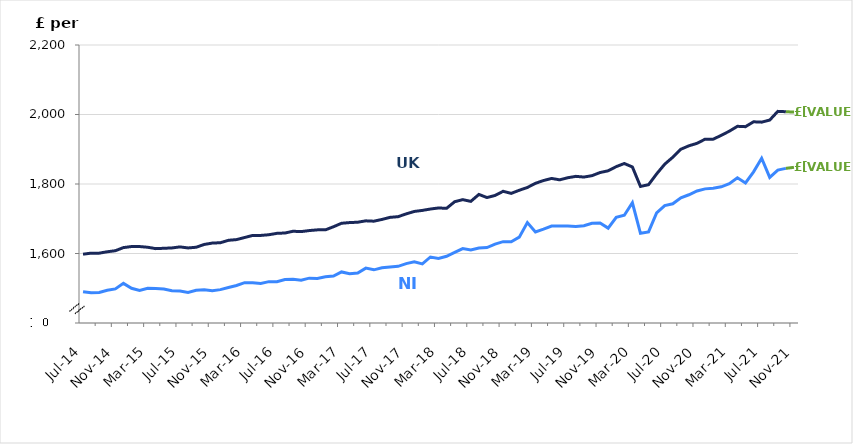
| Category | Series 0 | Series 1 |
|---|---|---|
| 2014-07-01 | 1490 | 1598 |
| 2014-08-01 | 1487 | 1601 |
| 2014-09-01 | 1488 | 1601 |
| 2014-10-01 | 1494 | 1605 |
| 2014-11-01 | 1498 | 1608 |
| 2014-12-01 | 1514 | 1617 |
| 2015-01-01 | 1500 | 1620 |
| 2015-02-01 | 1494 | 1620 |
| 2015-03-01 | 1500 | 1618 |
| 2015-04-01 | 1499 | 1614 |
| 2015-05-01 | 1498 | 1615 |
| 2015-06-01 | 1493 | 1616 |
| 2015-07-01 | 1492 | 1619 |
| 2015-08-01 | 1488 | 1616 |
| 2015-09-01 | 1494 | 1618 |
| 2015-10-01 | 1496 | 1626 |
| 2015-11-01 | 1493 | 1630 |
| 2015-12-01 | 1496 | 1631 |
| 2016-01-01 | 1502 | 1638 |
| 2016-02-01 | 1508 | 1640 |
| 2016-03-01 | 1516 | 1646 |
| 2016-04-01 | 1516 | 1652 |
| 2016-05-01 | 1514 | 1652 |
| 2016-06-01 | 1519 | 1654 |
| 2016-07-01 | 1519 | 1658 |
| 2016-08-01 | 1525 | 1659 |
| 2016-09-01 | 1526 | 1664 |
| 2016-10-01 | 1523 | 1663 |
| 2016-11-01 | 1529 | 1666 |
| 2016-12-01 | 1528 | 1668 |
| 2017-01-01 | 1533 | 1668 |
| 2017-02-01 | 1535 | 1677 |
| 2017-03-01 | 1547 | 1687 |
| 2017-04-01 | 1542 | 1689 |
| 2017-05-01 | 1544 | 1690 |
| 2017-06-01 | 1558 | 1694 |
| 2017-07-01 | 1553 | 1693 |
| 2017-08-01 | 1559 | 1698 |
| 2017-09-01 | 1561 | 1704 |
| 2017-10-01 | 1563 | 1706 |
| 2017-11-01 | 1571 | 1714 |
| 2017-12-01 | 1576 | 1721 |
| 2018-01-01 | 1570 | 1724 |
| 2018-02-01 | 1590 | 1728 |
| 2018-03-01 | 1586 | 1731 |
| 2018-04-01 | 1592 | 1730 |
| 2018-05-01 | 1603 | 1749 |
| 2018-06-01 | 1614 | 1755 |
| 2018-07-01 | 1610 | 1750 |
| 2018-08-01 | 1616 | 1770 |
| 2018-09-01 | 1617 | 1761 |
| 2018-10-01 | 1627 | 1767 |
| 2018-11-01 | 1634 | 1779 |
| 2018-12-01 | 1634 | 1773 |
| 2019-01-01 | 1647 | 1782 |
| 2019-02-01 | 1689 | 1790 |
| 2019-03-01 | 1662 | 1802 |
| 2019-04-01 | 1670 | 1810 |
| 2019-05-01 | 1679 | 1816 |
| 2019-06-01 | 1679 | 1812 |
| 2019-07-01 | 1679 | 1818 |
| 2019-08-01 | 1678 | 1822 |
| 2019-09-01 | 1680 | 1820 |
| 2019-10-01 | 1687 | 1824 |
| 2019-11-01 | 1688 | 1833 |
| 2019-12-01 | 1673 | 1838 |
| 2020-01-01 | 1704 | 1850 |
| 2020-02-01 | 1710 | 1859 |
| 2020-03-01 | 1746 | 1849 |
| 2020-04-01 | 1658 | 1793 |
| 2020-05-01 | 1662 | 1798 |
| 2020-06-01 | 1717 | 1829 |
| 2020-07-01 | 1738 | 1857 |
| 2020-08-01 | 1743 | 1877 |
| 2020-09-01 | 1760 | 1900 |
| 2020-10-01 | 1769 | 1910 |
| 2020-11-01 | 1780 | 1917 |
| 2020-12-01 | 1786 | 1929 |
| 2021-01-01 | 1788 | 1929 |
| 2021-02-01 | 1792 | 1940 |
| 2021-03-01 | 1801 | 1952 |
| 2021-04-01 | 1818 | 1966 |
| 2021-05-01 | 1803 | 1965 |
| 2021-06-01 | 1835 | 1979 |
| 2021-07-01 | 1874 | 1978 |
| 2021-08-01 | 1819 | 1984 |
| 2021-09-01 | 1840 | 2009 |
| 2021-10-01 | 1845 | 2008 |
| 2021-11-01 | 1848 | 2007 |